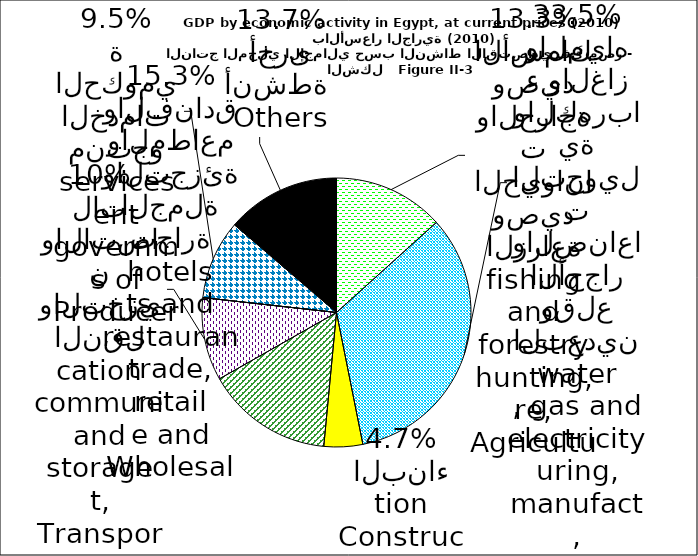
| Category | Series 0 |
|---|---|
| 0 | 160715.5 |
| 1 | 404643.7 |
| 2 | 56183.7 |
| 3 | 184400.3 |
| 4 | 120394 |
| 5 | 0 |
| 6 | 114943.9 |
| 7 | 165358.4 |